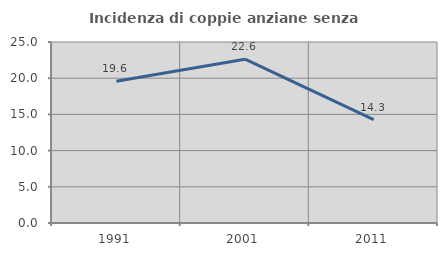
| Category | Incidenza di coppie anziane senza figli  |
|---|---|
| 1991.0 | 19.574 |
| 2001.0 | 22.632 |
| 2011.0 | 14.286 |